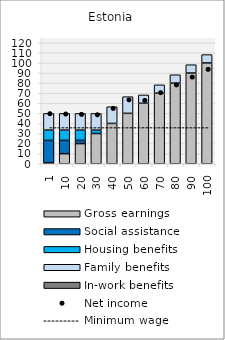
| Category | Gross earnings | Social assistance | Housing benefits | Family benefits | In-work benefits |
|---|---|---|---|---|---|
| 1.0 | 0.997 | 22.185 | 10.18 | 16.558 | 0 |
| 10.0 | 9.996 | 13.185 | 10.18 | 16.558 | 0 |
| 20.0 | 20 | 3.181 | 10.18 | 16.558 | 0 |
| 30.0 | 29.996 | 0 | 3.365 | 16.558 | 0 |
| 40.0 | 40 | 0 | 0 | 16.558 | 0 |
| 50.0 | 49.996 | 0 | 0 | 16.558 | 0 |
| 60.0 | 60 | 0 | 0 | 8.279 | 0 |
| 70.0 | 69.996 | 0 | 0 | 8.279 | 0 |
| 80.0 | 80 | 0 | 0 | 8.279 | 0 |
| 90.0 | 89.996 | 0 | 0 | 8.279 | 0 |
| 100.0 | 100 | 0 | 0 | 8.279 | 0 |